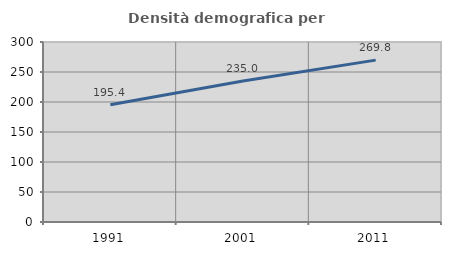
| Category | Densità demografica |
|---|---|
| 1991.0 | 195.373 |
| 2001.0 | 234.992 |
| 2011.0 | 269.801 |